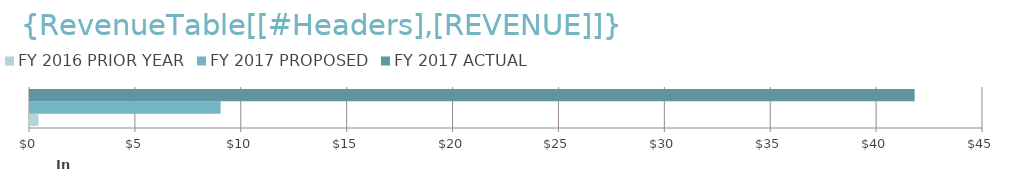
| Category | FY 2016 | FY 2017 |
|---|---|---|
| 0 | 400 | 41772.48 |